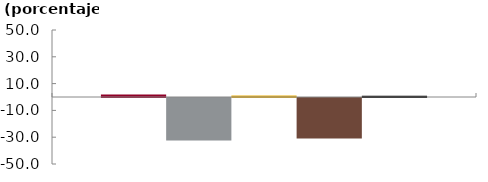
| Category | Bancos | CF | CFC | Coop | Sistema |
|---|---|---|---|---|---|
|  | 1.934 | -31.754 | 1.103 | -30.277 | 0.98 |